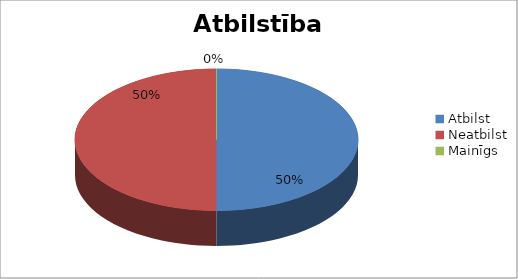
| Category | Series 0 |
|---|---|
| Atbilst | 4 |
| Neatbilst | 4 |
| Mainīgs | 0 |